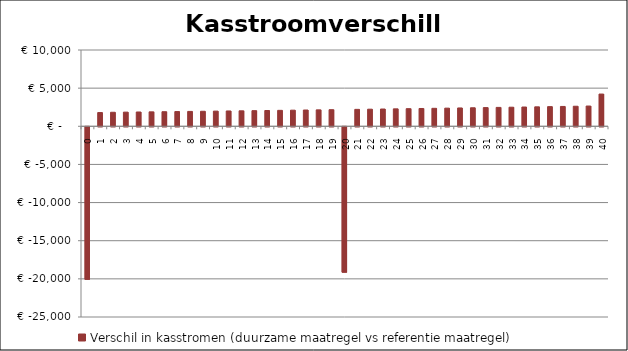
| Category | Verschil in kasstromen (duurzame maatregel vs referentie maatregel) |
|---|---|
| 0.0 | -20000 |
| 1.0 | 1800 |
| 2.0 | 1836.18 |
| 3.0 | 1854.542 |
| 4.0 | 1873.087 |
| 5.0 | 1891.818 |
| 6.0 | 1910.736 |
| 7.0 | 1929.844 |
| 8.0 | 1949.142 |
| 9.0 | 1968.633 |
| 10.0 | 1988.32 |
| 11.0 | 2008.203 |
| 12.0 | 2028.285 |
| 13.0 | 2048.568 |
| 14.0 | 2069.054 |
| 15.0 | 2089.744 |
| 16.0 | 2110.642 |
| 17.0 | 2131.748 |
| 18.0 | 2153.065 |
| 19.0 | 2174.596 |
| 20.0 | -19052.706 |
| 21.0 | 2218.305 |
| 22.0 | 2240.489 |
| 23.0 | 2262.893 |
| 24.0 | 2285.522 |
| 25.0 | 2308.378 |
| 26.0 | 2331.461 |
| 27.0 | 2354.776 |
| 28.0 | 2378.324 |
| 29.0 | 2402.107 |
| 30.0 | 2426.128 |
| 31.0 | 2450.389 |
| 32.0 | 2474.893 |
| 33.0 | 2499.642 |
| 34.0 | 2524.639 |
| 35.0 | 2549.885 |
| 36.0 | 2575.384 |
| 37.0 | 2601.138 |
| 38.0 | 2627.149 |
| 39.0 | 2653.421 |
| 40.0 | 4225.582 |